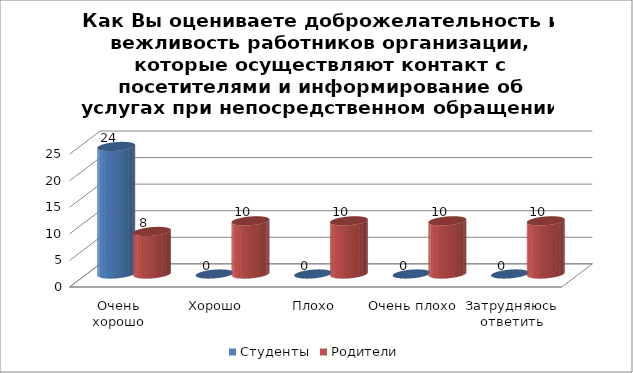
| Category | Студенты | Родители |
|---|---|---|
| Очень хорошо | 24 | 8 |
| Хорошо | 0 | 10 |
| Плохо | 0 | 10 |
| Очень плохо | 0 | 10 |
| Затрудняюсь ответить | 0 | 10 |